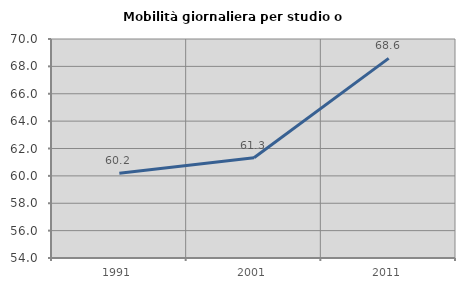
| Category | Mobilità giornaliera per studio o lavoro |
|---|---|
| 1991.0 | 60.195 |
| 2001.0 | 61.329 |
| 2011.0 | 68.586 |